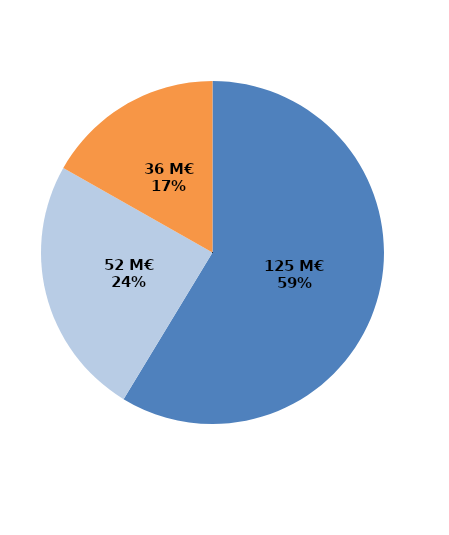
| Category | Series 0 |
|---|---|
| Formations certifiantes et pré-certifiantes | 124.877 |
| Formations professionnalisantes | 52.21 |
| Formations d'insertion sociale et professionnelle | 35.739 |